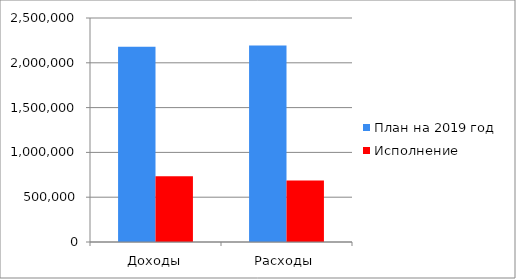
| Category | План на 2019 год | Исполнение |
|---|---|---|
| Доходы | 2179550.74 | 733808.01 |
| Расходы | 2192314.48 | 685927.94 |